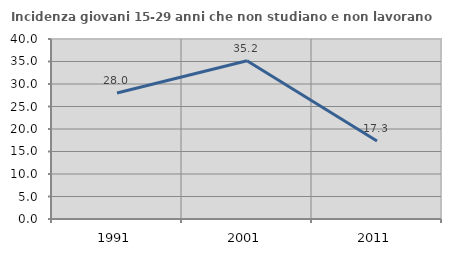
| Category | Incidenza giovani 15-29 anni che non studiano e non lavorano  |
|---|---|
| 1991.0 | 28 |
| 2001.0 | 35.161 |
| 2011.0 | 17.316 |